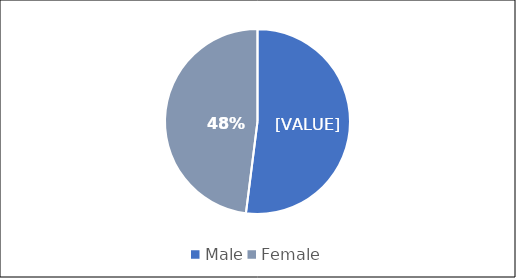
| Category | Series 0 |
|---|---|
| Male | 0.52 |
| Female | 0.48 |